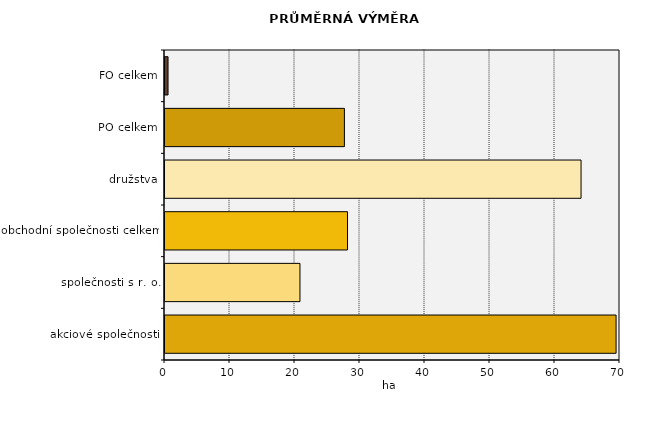
| Category | Průměrná 
výměra vinic |
|---|---|
| FO celkem | 0.468 |
| PO celkem | 27.602 |
| družstva | 64.009 |
| obchodní společnosti celkem | 28.078 |
| společnosti s r. o. | 20.763 |
| akciové společnosti | 69.398 |